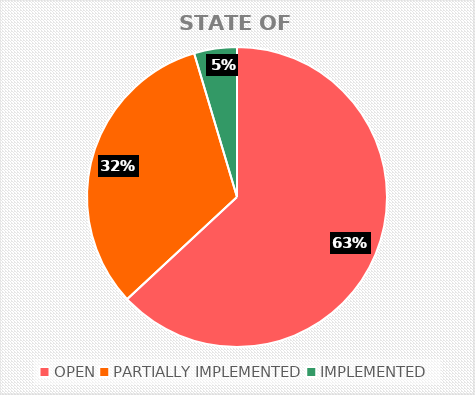
| Category | STATE OF MEASURES |
|---|---|
| OPEN | 41 |
| PARTIALLY IMPLEMENTED | 21 |
| IMPLEMENTED | 3 |